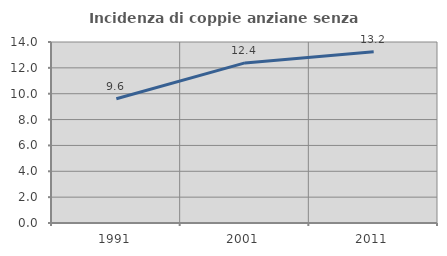
| Category | Incidenza di coppie anziane senza figli  |
|---|---|
| 1991.0 | 9.614 |
| 2001.0 | 12.382 |
| 2011.0 | 13.243 |